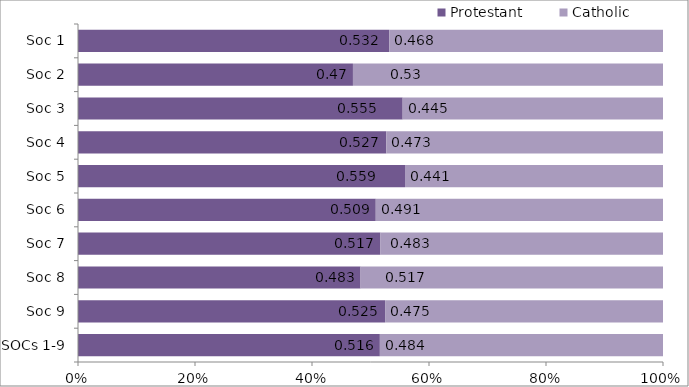
| Category | Protestant | Catholic |
|---|---|---|
| SOCs 1-9 | 0.516 | 0.484 |
| Soc 9 | 0.525 | 0.475 |
| Soc 8 | 0.483 | 0.517 |
| Soc 7 | 0.517 | 0.483 |
| Soc 6 | 0.509 | 0.491 |
| Soc 5 | 0.559 | 0.441 |
| Soc 4 | 0.527 | 0.473 |
| Soc 3 | 0.555 | 0.445 |
| Soc 2 | 0.47 | 0.53 |
| Soc 1 | 0.532 | 0.468 |